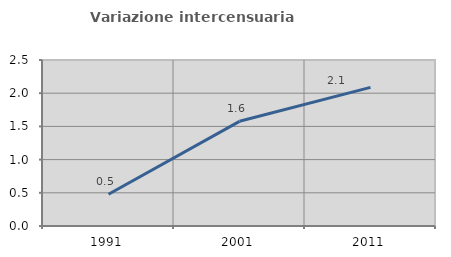
| Category | Variazione intercensuaria annua |
|---|---|
| 1991.0 | 0.479 |
| 2001.0 | 1.577 |
| 2011.0 | 2.088 |